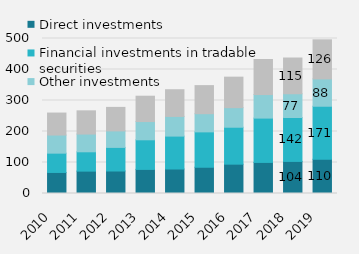
| Category | Direct investments | Financial investments in tradable securities | Other investments | Reserve assets |
|---|---|---|---|---|
| 2010 | 67892.817 | 62240.128 | 58445.125 | 70913.258 |
| 2011 | 72176.68 | 62365.267 | 57212.043 | 74875.187 |
| 2012 | 72564.652 | 76126.477 | 53188.317 | 75905.559 |
| 2013 | 77745.084 | 95519.668 | 58789.511 | 81789.758 |
| 2014 | 79010.985 | 106173.258 | 63433.259 | 86101.168 |
| 2015 | 84695.311 | 114101.897 | 58628.597 | 90574.784 |
| 2016 | 94632.854 | 119148.01 | 63097.726 | 98446.771 |
| 2017 | 100260.18 | 142990.21 | 75938.436 | 113011.493 |
| 2018 | 103505.863 | 141704.212 | 76535.741 | 115279.449 |
| 2019 | 110384 | 171112 | 88179.265 | 126014 |